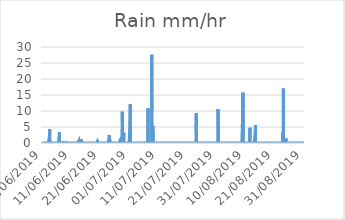
| Category | Rain |
|---|---|
| 01/06/2019 | 0 |
| 01/06/2019 | 0 |
| 01/06/2019 | 0 |
| 01/06/2019 | 0 |
| 01/06/2019 | 0 |
| 01/06/2019 | 0 |
| 01/06/2019 | 0 |
| 01/06/2019 | 0 |
| 01/06/2019 | 0 |
| 01/06/2019 | 0 |
| 01/06/2019 | 0 |
| 01/06/2019 | 0 |
| 01/06/2019 | 0 |
| 01/06/2019 | 0 |
| 01/06/2019 | 0 |
| 01/06/2019 | 0 |
| 01/06/2019 | 0 |
| 01/06/2019 | 0 |
| 01/06/2019 | 0 |
| 01/06/2019 | 0 |
| 01/06/2019 | 0 |
| 01/06/2019 | 0 |
| 01/06/2019 | 0 |
| 01/06/2019 | 0 |
| 02/06/2019 | 0 |
| 02/06/2019 | 0 |
| 02/06/2019 | 0 |
| 02/06/2019 | 0 |
| 02/06/2019 | 0 |
| 02/06/2019 | 0 |
| 02/06/2019 | 0 |
| 02/06/2019 | 0 |
| 02/06/2019 | 0 |
| 02/06/2019 | 0 |
| 02/06/2019 | 0 |
| 02/06/2019 | 0 |
| 02/06/2019 | 0 |
| 02/06/2019 | 0 |
| 02/06/2019 | 0 |
| 02/06/2019 | 0 |
| 02/06/2019 | 0 |
| 02/06/2019 | 0 |
| 02/06/2019 | 0 |
| 02/06/2019 | 0 |
| 02/06/2019 | 0 |
| 02/06/2019 | 0 |
| 02/06/2019 | 0 |
| 02/06/2019 | 0 |
| 03/06/2019 | 0 |
| 03/06/2019 | 0 |
| 03/06/2019 | 0 |
| 03/06/2019 | 0 |
| 03/06/2019 | 0 |
| 03/06/2019 | 0 |
| 03/06/2019 | 0 |
| 03/06/2019 | 0 |
| 03/06/2019 | 0 |
| 03/06/2019 | 0 |
| 03/06/2019 | 0 |
| 03/06/2019 | 0 |
| 03/06/2019 | 0 |
| 03/06/2019 | 0 |
| 03/06/2019 | 0 |
| 03/06/2019 | 2.6 |
| 03/06/2019 | 4.3 |
| 03/06/2019 | 0.2 |
| 03/06/2019 | 0 |
| 03/06/2019 | 0 |
| 03/06/2019 | 0 |
| 03/06/2019 | 0 |
| 03/06/2019 | 0 |
| 03/06/2019 | 0 |
| 04/06/2019 | 0 |
| 04/06/2019 | 0 |
| 04/06/2019 | 0 |
| 04/06/2019 | 0 |
| 04/06/2019 | 0 |
| 04/06/2019 | 0 |
| 04/06/2019 | 0 |
| 04/06/2019 | 0 |
| 04/06/2019 | 0 |
| 04/06/2019 | 0 |
| 04/06/2019 | 0 |
| 04/06/2019 | 0 |
| 04/06/2019 | 0 |
| 04/06/2019 | 0 |
| 04/06/2019 | 0 |
| 04/06/2019 | 0 |
| 04/06/2019 | 0 |
| 04/06/2019 | 0 |
| 04/06/2019 | 0 |
| 04/06/2019 | 0 |
| 04/06/2019 | 0 |
| 04/06/2019 | 0 |
| 04/06/2019 | 0 |
| 04/06/2019 | 0 |
| 05/06/2019 | 0 |
| 05/06/2019 | 0 |
| 05/06/2019 | 0 |
| 05/06/2019 | 0 |
| 05/06/2019 | 0 |
| 05/06/2019 | 0 |
| 05/06/2019 | 0 |
| 05/06/2019 | 0 |
| 05/06/2019 | 0 |
| 05/06/2019 | 0 |
| 05/06/2019 | 0 |
| 05/06/2019 | 0 |
| 05/06/2019 | 0 |
| 05/06/2019 | 0 |
| 05/06/2019 | 0 |
| 05/06/2019 | 0 |
| 05/06/2019 | 0 |
| 05/06/2019 | 0 |
| 05/06/2019 | 0 |
| 05/06/2019 | 0 |
| 05/06/2019 | 0 |
| 05/06/2019 | 0 |
| 05/06/2019 | 0 |
| 05/06/2019 | 0 |
| 06/06/2019 | 0 |
| 06/06/2019 | 0 |
| 06/06/2019 | 0 |
| 06/06/2019 | 0 |
| 06/06/2019 | 0 |
| 06/06/2019 | 0 |
| 06/06/2019 | 0 |
| 06/06/2019 | 0 |
| 06/06/2019 | 0 |
| 06/06/2019 | 0 |
| 06/06/2019 | 0 |
| 06/06/2019 | 0 |
| 06/06/2019 | 0 |
| 06/06/2019 | 0 |
| 06/06/2019 | 0 |
| 06/06/2019 | 0 |
| 06/06/2019 | 0 |
| 06/06/2019 | 0 |
| 06/06/2019 | 0 |
| 06/06/2019 | 0 |
| 06/06/2019 | 0 |
| 06/06/2019 | 0 |
| 06/06/2019 | 0 |
| 06/06/2019 | 0 |
| 07/06/2019 | 0 |
| 07/06/2019 | 0 |
| 07/06/2019 | 3.4 |
| 07/06/2019 | 0 |
| 07/06/2019 | 0 |
| 07/06/2019 | 0 |
| 07/06/2019 | 0 |
| 07/06/2019 | 0 |
| 07/06/2019 | 0 |
| 07/06/2019 | 0 |
| 07/06/2019 | 0 |
| 07/06/2019 | 0 |
| 07/06/2019 | 0 |
| 07/06/2019 | 0 |
| 07/06/2019 | 0 |
| 07/06/2019 | 0 |
| 07/06/2019 | 0 |
| 07/06/2019 | 0 |
| 07/06/2019 | 0 |
| 07/06/2019 | 0 |
| 07/06/2019 | 0 |
| 07/06/2019 | 0 |
| 07/06/2019 | 0 |
| 07/06/2019 | 0 |
| 08/06/2019 | 0 |
| 08/06/2019 | 0 |
| 08/06/2019 | 0 |
| 08/06/2019 | 0 |
| 08/06/2019 | 0.2 |
| 08/06/2019 | 0.1 |
| 08/06/2019 | 0.2 |
| 08/06/2019 | 0 |
| 08/06/2019 | 0.2 |
| 08/06/2019 | 0 |
| 08/06/2019 | 0 |
| 08/06/2019 | 0 |
| 08/06/2019 | 0 |
| 08/06/2019 | 0 |
| 08/06/2019 | 0 |
| 08/06/2019 | 0 |
| 08/06/2019 | 0 |
| 08/06/2019 | 0 |
| 08/06/2019 | 0 |
| 08/06/2019 | 0 |
| 08/06/2019 | 0 |
| 08/06/2019 | 0 |
| 08/06/2019 | 0 |
| 08/06/2019 | 0 |
| 09/06/2019 | 0 |
| 09/06/2019 | 0 |
| 09/06/2019 | 0 |
| 09/06/2019 | 0 |
| 09/06/2019 | 0 |
| 09/06/2019 | 0 |
| 09/06/2019 | 0 |
| 09/06/2019 | 0 |
| 09/06/2019 | 0 |
| 09/06/2019 | 0.2 |
| 09/06/2019 | 0 |
| 09/06/2019 | 0 |
| 09/06/2019 | 0 |
| 09/06/2019 | 0 |
| 09/06/2019 | 0 |
| 09/06/2019 | 0 |
| 09/06/2019 | 0 |
| 09/06/2019 | 0 |
| 09/06/2019 | 0 |
| 09/06/2019 | 0 |
| 09/06/2019 | 0 |
| 09/06/2019 | 0 |
| 09/06/2019 | 0 |
| 09/06/2019 | 0 |
| 10/06/2019 | 0 |
| 10/06/2019 | 0 |
| 10/06/2019 | 0 |
| 10/06/2019 | 0 |
| 10/06/2019 | 0 |
| 10/06/2019 | 0 |
| 10/06/2019 | 0 |
| 10/06/2019 | 0 |
| 10/06/2019 | 0 |
| 10/06/2019 | 0 |
| 10/06/2019 | 0 |
| 10/06/2019 | 0 |
| 10/06/2019 | 0 |
| 10/06/2019 | 0 |
| 10/06/2019 | 0 |
| 10/06/2019 | 0 |
| 10/06/2019 | 0 |
| 10/06/2019 | 0 |
| 10/06/2019 | 0 |
| 10/06/2019 | 0 |
| 10/06/2019 | 0 |
| 10/06/2019 | 0 |
| 10/06/2019 | 0 |
| 10/06/2019 | 0 |
| 11/06/2019 | 0 |
| 11/06/2019 | 0 |
| 11/06/2019 | 0 |
| 11/06/2019 | 0 |
| 11/06/2019 | 0 |
| 11/06/2019 | 0 |
| 11/06/2019 | 0 |
| 11/06/2019 | 0 |
| 11/06/2019 | 0 |
| 11/06/2019 | 0 |
| 11/06/2019 | 0 |
| 11/06/2019 | 0 |
| 11/06/2019 | 0 |
| 11/06/2019 | 0 |
| 11/06/2019 | 0 |
| 11/06/2019 | 0 |
| 11/06/2019 | 0.1 |
| 11/06/2019 | 0 |
| 11/06/2019 | 0 |
| 11/06/2019 | 0 |
| 11/06/2019 | 0 |
| 11/06/2019 | 0 |
| 11/06/2019 | 0 |
| 11/06/2019 | 0 |
| 12/06/2019 | 0 |
| 12/06/2019 | 0 |
| 12/06/2019 | 0 |
| 12/06/2019 | 0 |
| 12/06/2019 | 0 |
| 12/06/2019 | 0 |
| 12/06/2019 | 0 |
| 12/06/2019 | 0 |
| 12/06/2019 | 0 |
| 12/06/2019 | 0 |
| 12/06/2019 | 0 |
| 12/06/2019 | 0 |
| 12/06/2019 | 0 |
| 12/06/2019 | 0 |
| 12/06/2019 | 0 |
| 12/06/2019 | 0 |
| 12/06/2019 | 0 |
| 12/06/2019 | 0 |
| 12/06/2019 | 0 |
| 12/06/2019 | 0 |
| 12/06/2019 | 0 |
| 12/06/2019 | 0 |
| 12/06/2019 | 0 |
| 12/06/2019 | 0 |
| 13/06/2019 | 0 |
| 13/06/2019 | 0 |
| 13/06/2019 | 0.3 |
| 13/06/2019 | 0.1 |
| 13/06/2019 | 0 |
| 13/06/2019 | 0 |
| 13/06/2019 | 0 |
| 13/06/2019 | 0 |
| 13/06/2019 | 0 |
| 13/06/2019 | 0 |
| 13/06/2019 | 0 |
| 13/06/2019 | 0 |
| 13/06/2019 | 0 |
| 13/06/2019 | 0 |
| 13/06/2019 | 0 |
| 13/06/2019 | 0 |
| 13/06/2019 | 0 |
| 13/06/2019 | 0 |
| 13/06/2019 | 0 |
| 13/06/2019 | 0.1 |
| 13/06/2019 | 0.6 |
| 13/06/2019 | 0.1 |
| 13/06/2019 | 0 |
| 13/06/2019 | 0 |
| 14/06/2019 | 0 |
| 14/06/2019 | 0 |
| 14/06/2019 | 0 |
| 14/06/2019 | 0 |
| 14/06/2019 | 0 |
| 14/06/2019 | 0 |
| 14/06/2019 | 0 |
| 14/06/2019 | 0 |
| 14/06/2019 | 0 |
| 14/06/2019 | 0 |
| 14/06/2019 | 0 |
| 14/06/2019 | 0 |
| 14/06/2019 | 0 |
| 14/06/2019 | 0 |
| 14/06/2019 | 0 |
| 14/06/2019 | 0 |
| 14/06/2019 | 0 |
| 14/06/2019 | 1.2 |
| 14/06/2019 | 0 |
| 14/06/2019 | 0 |
| 14/06/2019 | 0 |
| 14/06/2019 | 0 |
| 14/06/2019 | 0 |
| 14/06/2019 | 0 |
| 15/06/2019 | 0 |
| 15/06/2019 | 0 |
| 15/06/2019 | 0 |
| 15/06/2019 | 0 |
| 15/06/2019 | 0 |
| 15/06/2019 | 0 |
| 15/06/2019 | 0 |
| 15/06/2019 | 0 |
| 15/06/2019 | 0 |
| 15/06/2019 | 0 |
| 15/06/2019 | 0 |
| 15/06/2019 | 0 |
| 15/06/2019 | 0 |
| 15/06/2019 | 0 |
| 15/06/2019 | 0 |
| 15/06/2019 | 0 |
| 15/06/2019 | 0 |
| 15/06/2019 | 0 |
| 15/06/2019 | 0 |
| 15/06/2019 | 0 |
| 15/06/2019 | 0 |
| 15/06/2019 | 0 |
| 15/06/2019 | 0 |
| 15/06/2019 | 0 |
| 16/06/2019 | 0 |
| 16/06/2019 | 0 |
| 16/06/2019 | 0 |
| 16/06/2019 | 0 |
| 16/06/2019 | 0 |
| 16/06/2019 | 0 |
| 16/06/2019 | 0 |
| 16/06/2019 | 0 |
| 16/06/2019 | 0 |
| 16/06/2019 | 0 |
| 16/06/2019 | 0 |
| 16/06/2019 | 0 |
| 16/06/2019 | 0 |
| 16/06/2019 | 0 |
| 16/06/2019 | 0 |
| 16/06/2019 | 0 |
| 16/06/2019 | 0 |
| 16/06/2019 | 0 |
| 16/06/2019 | 0 |
| 16/06/2019 | 0 |
| 16/06/2019 | 0 |
| 16/06/2019 | 0 |
| 16/06/2019 | 0 |
| 16/06/2019 | 0 |
| 17/06/2019 | 0 |
| 17/06/2019 | 0 |
| 17/06/2019 | 0 |
| 17/06/2019 | 0 |
| 17/06/2019 | 0 |
| 17/06/2019 | 0 |
| 17/06/2019 | 0 |
| 17/06/2019 | 0 |
| 17/06/2019 | 0 |
| 17/06/2019 | 0 |
| 17/06/2019 | 0 |
| 17/06/2019 | 0 |
| 17/06/2019 | 0 |
| 17/06/2019 | 0 |
| 17/06/2019 | 0 |
| 17/06/2019 | 0 |
| 17/06/2019 | 0 |
| 17/06/2019 | 0 |
| 17/06/2019 | 0 |
| 17/06/2019 | 0 |
| 17/06/2019 | 0 |
| 17/06/2019 | 0 |
| 17/06/2019 | 0 |
| 17/06/2019 | 0 |
| 18/06/2019 | 0 |
| 18/06/2019 | 0 |
| 18/06/2019 | 0 |
| 18/06/2019 | 0 |
| 18/06/2019 | 0 |
| 18/06/2019 | 0 |
| 18/06/2019 | 0 |
| 18/06/2019 | 0 |
| 18/06/2019 | 0 |
| 18/06/2019 | 0 |
| 18/06/2019 | 0 |
| 18/06/2019 | 0 |
| 18/06/2019 | 0 |
| 18/06/2019 | 0 |
| 18/06/2019 | 0 |
| 18/06/2019 | 0 |
| 18/06/2019 | 0 |
| 18/06/2019 | 0 |
| 18/06/2019 | 0 |
| 18/06/2019 | 0 |
| 18/06/2019 | 0 |
| 18/06/2019 | 0 |
| 18/06/2019 | 0 |
| 18/06/2019 | 0 |
| 19/06/2019 | 0 |
| 19/06/2019 | 0 |
| 19/06/2019 | 0 |
| 19/06/2019 | 0 |
| 19/06/2019 | 0 |
| 19/06/2019 | 0 |
| 19/06/2019 | 0 |
| 19/06/2019 | 0 |
| 19/06/2019 | 0 |
| 19/06/2019 | 0 |
| 19/06/2019 | 0 |
| 19/06/2019 | 0.1 |
| 19/06/2019 | 0 |
| 19/06/2019 | 0 |
| 19/06/2019 | 0 |
| 19/06/2019 | 0 |
| 19/06/2019 | 0 |
| 19/06/2019 | 0 |
| 19/06/2019 | 0 |
| 19/06/2019 | 0 |
| 19/06/2019 | 0 |
| 19/06/2019 | 0 |
| 19/06/2019 | 0 |
| 19/06/2019 | 0 |
| 20/06/2019 | 0 |
| 20/06/2019 | 0 |
| 20/06/2019 | 0 |
| 20/06/2019 | 0 |
| 20/06/2019 | 0 |
| 20/06/2019 | 0 |
| 20/06/2019 | 0.4 |
| 20/06/2019 | 0.7 |
| 20/06/2019 | 0 |
| 20/06/2019 | 0.8 |
| 20/06/2019 | 0.1 |
| 20/06/2019 | 0 |
| 20/06/2019 | 0 |
| 20/06/2019 | 0 |
| 20/06/2019 | 0 |
| 20/06/2019 | 0 |
| 20/06/2019 | 0 |
| 20/06/2019 | 0 |
| 20/06/2019 | 0 |
| 20/06/2019 | 0 |
| 20/06/2019 | 0 |
| 20/06/2019 | 0 |
| 20/06/2019 | 0 |
| 20/06/2019 | 0 |
| 21/06/2019 | 0 |
| 21/06/2019 | 0 |
| 21/06/2019 | 0 |
| 21/06/2019 | 0 |
| 21/06/2019 | 0 |
| 21/06/2019 | 0 |
| 21/06/2019 | 0 |
| 21/06/2019 | 0 |
| 21/06/2019 | 0.1 |
| 21/06/2019 | 0 |
| 21/06/2019 | 0 |
| 21/06/2019 | 0 |
| 21/06/2019 | 0 |
| 21/06/2019 | 0 |
| 21/06/2019 | 0 |
| 21/06/2019 | 0.1 |
| 21/06/2019 | 0 |
| 21/06/2019 | 0 |
| 21/06/2019 | 0 |
| 21/06/2019 | 0 |
| 21/06/2019 | 0 |
| 21/06/2019 | 0 |
| 21/06/2019 | 0 |
| 21/06/2019 | 0 |
| 22/06/2019 | 0 |
| 22/06/2019 | 0 |
| 22/06/2019 | 0 |
| 22/06/2019 | 0 |
| 22/06/2019 | 0 |
| 22/06/2019 | 0 |
| 22/06/2019 | 0 |
| 22/06/2019 | 0 |
| 22/06/2019 | 0 |
| 22/06/2019 | 0 |
| 22/06/2019 | 0 |
| 22/06/2019 | 0 |
| 22/06/2019 | 0.2 |
| 22/06/2019 | 0.1 |
| 22/06/2019 | 0 |
| 22/06/2019 | 0 |
| 22/06/2019 | 0 |
| 22/06/2019 | 0 |
| 22/06/2019 | 0 |
| 22/06/2019 | 0 |
| 22/06/2019 | 0 |
| 22/06/2019 | 0 |
| 22/06/2019 | 0 |
| 22/06/2019 | 0 |
| 23/06/2019 | 0 |
| 23/06/2019 | 0 |
| 23/06/2019 | 0 |
| 23/06/2019 | 0 |
| 23/06/2019 | 0 |
| 23/06/2019 | 0 |
| 23/06/2019 | 0 |
| 23/06/2019 | 0 |
| 23/06/2019 | 0 |
| 23/06/2019 | 0 |
| 23/06/2019 | 0 |
| 23/06/2019 | 0 |
| 23/06/2019 | 0 |
| 23/06/2019 | 0 |
| 23/06/2019 | 0 |
| 23/06/2019 | 0 |
| 23/06/2019 | 0 |
| 23/06/2019 | 0 |
| 23/06/2019 | 0 |
| 23/06/2019 | 0 |
| 23/06/2019 | 0 |
| 23/06/2019 | 0 |
| 23/06/2019 | 0 |
| 23/06/2019 | 0 |
| 24/06/2019 | 0 |
| 24/06/2019 | 0 |
| 24/06/2019 | 0 |
| 24/06/2019 | 0 |
| 24/06/2019 | 0 |
| 24/06/2019 | 0 |
| 24/06/2019 | 0 |
| 24/06/2019 | 0 |
| 24/06/2019 | 0 |
| 24/06/2019 | 0 |
| 24/06/2019 | 0 |
| 24/06/2019 | 0 |
| 24/06/2019 | 0 |
| 24/06/2019 | 2.5 |
| 24/06/2019 | 0.1 |
| 24/06/2019 | 0 |
| 24/06/2019 | 0 |
| 24/06/2019 | 0.3 |
| 24/06/2019 | 0.1 |
| 24/06/2019 | 0.5 |
| 24/06/2019 | 0.4 |
| 24/06/2019 | 0 |
| 24/06/2019 | 0 |
| 24/06/2019 | 0 |
| 25/06/2019 | 0 |
| 25/06/2019 | 0 |
| 25/06/2019 | 0 |
| 25/06/2019 | 0 |
| 25/06/2019 | 0 |
| 25/06/2019 | 0 |
| 25/06/2019 | 0 |
| 25/06/2019 | 0 |
| 25/06/2019 | 0 |
| 25/06/2019 | 0 |
| 25/06/2019 | 0 |
| 25/06/2019 | 0 |
| 25/06/2019 | 0 |
| 25/06/2019 | 0 |
| 25/06/2019 | 0 |
| 25/06/2019 | 0 |
| 25/06/2019 | 0 |
| 25/06/2019 | 0 |
| 25/06/2019 | 0 |
| 25/06/2019 | 0 |
| 25/06/2019 | 0 |
| 25/06/2019 | 0 |
| 25/06/2019 | 0 |
| 25/06/2019 | 0 |
| 26/06/2019 | 0 |
| 26/06/2019 | 0 |
| 26/06/2019 | 0 |
| 26/06/2019 | 0 |
| 26/06/2019 | 0 |
| 26/06/2019 | 0 |
| 26/06/2019 | 0 |
| 26/06/2019 | 0 |
| 26/06/2019 | 0 |
| 26/06/2019 | 0 |
| 26/06/2019 | 0 |
| 26/06/2019 | 0 |
| 26/06/2019 | 0 |
| 26/06/2019 | 0 |
| 26/06/2019 | 0 |
| 26/06/2019 | 0 |
| 26/06/2019 | 0 |
| 26/06/2019 | 0 |
| 26/06/2019 | 0 |
| 26/06/2019 | 0 |
| 26/06/2019 | 0 |
| 26/06/2019 | 0 |
| 26/06/2019 | 0 |
| 26/06/2019 | 0 |
| 27/06/2019 | 0 |
| 27/06/2019 | 0 |
| 27/06/2019 | 0 |
| 27/06/2019 | 0 |
| 27/06/2019 | 0 |
| 27/06/2019 | 0 |
| 27/06/2019 | 0 |
| 27/06/2019 | 0 |
| 27/06/2019 | 0 |
| 27/06/2019 | 0 |
| 27/06/2019 | 0 |
| 27/06/2019 | 0 |
| 27/06/2019 | 0 |
| 27/06/2019 | 0 |
| 27/06/2019 | 0 |
| 27/06/2019 | 0 |
| 27/06/2019 | 0 |
| 27/06/2019 | 0 |
| 27/06/2019 | 0 |
| 27/06/2019 | 0 |
| 27/06/2019 | 0 |
| 27/06/2019 | 0 |
| 27/06/2019 | 0 |
| 27/06/2019 | 0 |
| 28/06/2019 | 0 |
| 28/06/2019 | 0 |
| 28/06/2019 | 0.1 |
| 28/06/2019 | 0.5 |
| 28/06/2019 | 0.5 |
| 28/06/2019 | 0 |
| 28/06/2019 | 0 |
| 28/06/2019 | 0 |
| 28/06/2019 | 0 |
| 28/06/2019 | 0 |
| 28/06/2019 | 0 |
| 28/06/2019 | 0 |
| 28/06/2019 | 0 |
| 28/06/2019 | 0 |
| 28/06/2019 | 0 |
| 28/06/2019 | 0 |
| 28/06/2019 | 0 |
| 28/06/2019 | 0 |
| 28/06/2019 | 0 |
| 28/06/2019 | 0 |
| 28/06/2019 | 0 |
| 28/06/2019 | 0 |
| 28/06/2019 | 0 |
| 28/06/2019 | 0 |
| 29/06/2019 | 0 |
| 29/06/2019 | 0 |
| 29/06/2019 | 9.8 |
| 29/06/2019 | 0 |
| 29/06/2019 | 0 |
| 29/06/2019 | 0 |
| 29/06/2019 | 0 |
| 29/06/2019 | 0 |
| 29/06/2019 | 0 |
| 29/06/2019 | 0 |
| 29/06/2019 | 0 |
| 29/06/2019 | 0 |
| 29/06/2019 | 0 |
| 29/06/2019 | 0 |
| 29/06/2019 | 3.2 |
| 29/06/2019 | 0 |
| 29/06/2019 | 0 |
| 29/06/2019 | 0 |
| 29/06/2019 | 0 |
| 29/06/2019 | 0 |
| 29/06/2019 | 0 |
| 29/06/2019 | 0 |
| 29/06/2019 | 0 |
| 29/06/2019 | 0 |
| 30/06/2019 | 0 |
| 30/06/2019 | 0 |
| 30/06/2019 | 0 |
| 30/06/2019 | 0 |
| 30/06/2019 | 0 |
| 30/06/2019 | 0 |
| 30/06/2019 | 0 |
| 30/06/2019 | 0 |
| 30/06/2019 | 0 |
| 30/06/2019 | 0 |
| 30/06/2019 | 0 |
| 30/06/2019 | 0 |
| 30/06/2019 | 0 |
| 30/06/2019 | 0 |
| 30/06/2019 | 0 |
| 30/06/2019 | 0 |
| 30/06/2019 | 0 |
| 30/06/2019 | 0 |
| 30/06/2019 | 0 |
| 30/06/2019 | 0 |
| 30/06/2019 | 0 |
| 30/06/2019 | 0 |
| 30/06/2019 | 0 |
| 30/06/2019 | 0 |
| 01/07/2019 | 0 |
| 01/07/2019 | 0 |
| 01/07/2019 | 0 |
| 01/07/2019 | 0 |
| 01/07/2019 | 0 |
| 01/07/2019 | 0 |
| 01/07/2019 | 0 |
| 01/07/2019 | 0 |
| 01/07/2019 | 0 |
| 01/07/2019 | 0 |
| 01/07/2019 | 0 |
| 01/07/2019 | 0 |
| 01/07/2019 | 0 |
| 01/07/2019 | 0 |
| 01/07/2019 | 0 |
| 01/07/2019 | 0 |
| 01/07/2019 | 0 |
| 01/07/2019 | 0 |
| 01/07/2019 | 0 |
| 01/07/2019 | 0 |
| 01/07/2019 | 0 |
| 01/07/2019 | 12.1 |
| 01/07/2019 | 0.2 |
| 01/07/2019 | 0 |
| 02/07/2019 | 0 |
| 02/07/2019 | 0 |
| 02/07/2019 | 0 |
| 02/07/2019 | 0 |
| 02/07/2019 | 0 |
| 02/07/2019 | 0 |
| 02/07/2019 | 0 |
| 02/07/2019 | 0 |
| 02/07/2019 | 0 |
| 02/07/2019 | 0 |
| 02/07/2019 | 0 |
| 02/07/2019 | 0 |
| 02/07/2019 | 0 |
| 02/07/2019 | 0 |
| 02/07/2019 | 0 |
| 02/07/2019 | 0 |
| 02/07/2019 | 0 |
| 02/07/2019 | 0 |
| 02/07/2019 | 0 |
| 02/07/2019 | 0 |
| 02/07/2019 | 0 |
| 02/07/2019 | 0 |
| 02/07/2019 | 0 |
| 02/07/2019 | 0 |
| 03/07/2019 | 0 |
| 03/07/2019 | 0 |
| 03/07/2019 | 0 |
| 03/07/2019 | 0 |
| 03/07/2019 | 0 |
| 03/07/2019 | 0 |
| 03/07/2019 | 0 |
| 03/07/2019 | 0 |
| 03/07/2019 | 0 |
| 03/07/2019 | 0 |
| 03/07/2019 | 0 |
| 03/07/2019 | 0 |
| 03/07/2019 | 0 |
| 03/07/2019 | 0 |
| 03/07/2019 | 0 |
| 03/07/2019 | 0 |
| 03/07/2019 | 0 |
| 03/07/2019 | 0 |
| 03/07/2019 | 0 |
| 03/07/2019 | 0 |
| 03/07/2019 | 0 |
| 03/07/2019 | 0 |
| 03/07/2019 | 0 |
| 03/07/2019 | 0 |
| 04/07/2019 | 0 |
| 04/07/2019 | 0 |
| 04/07/2019 | 0 |
| 04/07/2019 | 0 |
| 04/07/2019 | 0 |
| 04/07/2019 | 0 |
| 04/07/2019 | 0 |
| 04/07/2019 | 0 |
| 04/07/2019 | 0 |
| 04/07/2019 | 0 |
| 04/07/2019 | 0 |
| 04/07/2019 | 0 |
| 04/07/2019 | 0 |
| 04/07/2019 | 0 |
| 04/07/2019 | 0 |
| 04/07/2019 | 0 |
| 04/07/2019 | 0 |
| 04/07/2019 | 0 |
| 04/07/2019 | 0 |
| 04/07/2019 | 0 |
| 04/07/2019 | 0 |
| 04/07/2019 | 0 |
| 04/07/2019 | 0 |
| 04/07/2019 | 0 |
| 05/07/2019 | 0 |
| 05/07/2019 | 0 |
| 05/07/2019 | 0 |
| 05/07/2019 | 0 |
| 05/07/2019 | 0 |
| 05/07/2019 | 0 |
| 05/07/2019 | 0 |
| 05/07/2019 | 0 |
| 05/07/2019 | 0 |
| 05/07/2019 | 0 |
| 05/07/2019 | 0 |
| 05/07/2019 | 0 |
| 05/07/2019 | 0 |
| 05/07/2019 | 0 |
| 05/07/2019 | 0 |
| 05/07/2019 | 0 |
| 05/07/2019 | 0 |
| 05/07/2019 | 0 |
| 05/07/2019 | 0 |
| 05/07/2019 | 0 |
| 05/07/2019 | 0 |
| 05/07/2019 | 0 |
| 05/07/2019 | 0 |
| 05/07/2019 | 0 |
| 06/07/2019 | 0 |
| 06/07/2019 | 0 |
| 06/07/2019 | 0 |
| 06/07/2019 | 0 |
| 06/07/2019 | 0 |
| 06/07/2019 | 0 |
| 06/07/2019 | 0 |
| 06/07/2019 | 0 |
| 06/07/2019 | 0 |
| 06/07/2019 | 0 |
| 06/07/2019 | 0 |
| 06/07/2019 | 0 |
| 06/07/2019 | 0 |
| 06/07/2019 | 0 |
| 06/07/2019 | 0 |
| 06/07/2019 | 0 |
| 06/07/2019 | 0 |
| 06/07/2019 | 0 |
| 06/07/2019 | 0 |
| 06/07/2019 | 0 |
| 06/07/2019 | 0 |
| 06/07/2019 | 0 |
| 06/07/2019 | 0 |
| 06/07/2019 | 0 |
| 07/07/2019 | 0 |
| 07/07/2019 | 0 |
| 07/07/2019 | 0 |
| 07/07/2019 | 0 |
| 07/07/2019 | 0 |
| 07/07/2019 | 0 |
| 07/07/2019 | 0 |
| 07/07/2019 | 0 |
| 07/07/2019 | 0 |
| 07/07/2019 | 0 |
| 07/07/2019 | 0 |
| 07/07/2019 | 0 |
| 07/07/2019 | 0 |
| 07/07/2019 | 0 |
| 07/07/2019 | 0 |
| 07/07/2019 | 0 |
| 07/07/2019 | 0 |
| 07/07/2019 | 0 |
| 07/07/2019 | 0 |
| 07/07/2019 | 0 |
| 07/07/2019 | 0 |
| 07/07/2019 | 0 |
| 07/07/2019 | 0 |
| 07/07/2019 | 0 |
| 08/07/2019 | 0 |
| 08/07/2019 | 7.1 |
| 08/07/2019 | 10.8 |
| 08/07/2019 | 0 |
| 08/07/2019 | 0 |
| 08/07/2019 | 0 |
| 08/07/2019 | 0 |
| 08/07/2019 | 0 |
| 08/07/2019 | 0 |
| 08/07/2019 | 0 |
| 08/07/2019 | 0 |
| 08/07/2019 | 0 |
| 08/07/2019 | 0 |
| 08/07/2019 | 0 |
| 08/07/2019 | 0 |
| 08/07/2019 | 0 |
| 08/07/2019 | 0 |
| 08/07/2019 | 0.2 |
| 08/07/2019 | 0 |
| 08/07/2019 | 0 |
| 08/07/2019 | 0 |
| 08/07/2019 | 0 |
| 08/07/2019 | 0 |
| 08/07/2019 | 0 |
| 09/07/2019 | 0 |
| 09/07/2019 | 0 |
| 09/07/2019 | 0 |
| 09/07/2019 | 0 |
| 09/07/2019 | 0 |
| 09/07/2019 | 0 |
| 09/07/2019 | 0 |
| 09/07/2019 | 0.1 |
| 09/07/2019 | 1 |
| 09/07/2019 | 27.6 |
| 09/07/2019 | 9.6 |
| 09/07/2019 | 2.8 |
| 09/07/2019 | 5.6 |
| 09/07/2019 | 3.6 |
| 09/07/2019 | 1 |
| 09/07/2019 | 1.8 |
| 09/07/2019 | 0.7 |
| 09/07/2019 | 0.1 |
| 09/07/2019 | 5.3 |
| 09/07/2019 | 0 |
| 09/07/2019 | 0 |
| 09/07/2019 | 0 |
| 09/07/2019 | 0 |
| 09/07/2019 | 0.2 |
| 10/07/2019 | 0 |
| 10/07/2019 | 0 |
| 10/07/2019 | 0 |
| 10/07/2019 | 0 |
| 10/07/2019 | 0 |
| 10/07/2019 | 0 |
| 10/07/2019 | 0 |
| 10/07/2019 | 0 |
| 10/07/2019 | 0 |
| 10/07/2019 | 0 |
| 10/07/2019 | 0 |
| 10/07/2019 | 0 |
| 10/07/2019 | 0 |
| 10/07/2019 | 0 |
| 10/07/2019 | 0 |
| 10/07/2019 | 0 |
| 10/07/2019 | 0 |
| 10/07/2019 | 0 |
| 10/07/2019 | 0 |
| 10/07/2019 | 0 |
| 10/07/2019 | 0 |
| 10/07/2019 | 0 |
| 10/07/2019 | 0 |
| 10/07/2019 | 0 |
| 11/07/2019 | 0 |
| 11/07/2019 | 0 |
| 11/07/2019 | 0 |
| 11/07/2019 | 0 |
| 11/07/2019 | 0 |
| 11/07/2019 | 0 |
| 11/07/2019 | 0 |
| 11/07/2019 | 0 |
| 11/07/2019 | 0 |
| 11/07/2019 | 0 |
| 11/07/2019 | 0 |
| 11/07/2019 | 0 |
| 11/07/2019 | 0 |
| 11/07/2019 | 0 |
| 11/07/2019 | 0 |
| 11/07/2019 | 0 |
| 11/07/2019 | 0 |
| 11/07/2019 | 0 |
| 11/07/2019 | 0 |
| 11/07/2019 | 0 |
| 11/07/2019 | 0 |
| 11/07/2019 | 0 |
| 11/07/2019 | 0 |
| 11/07/2019 | 0 |
| 12/07/2019 | 0 |
| 12/07/2019 | 0 |
| 12/07/2019 | 0 |
| 12/07/2019 | 0 |
| 12/07/2019 | 0 |
| 12/07/2019 | 0 |
| 12/07/2019 | 0 |
| 12/07/2019 | 0 |
| 12/07/2019 | 0 |
| 12/07/2019 | 0 |
| 12/07/2019 | 0 |
| 12/07/2019 | 0 |
| 12/07/2019 | 0 |
| 12/07/2019 | 0 |
| 12/07/2019 | 0 |
| 12/07/2019 | 0 |
| 12/07/2019 | 0 |
| 12/07/2019 | 0 |
| 12/07/2019 | 0 |
| 12/07/2019 | 0 |
| 12/07/2019 | 0 |
| 12/07/2019 | 0 |
| 12/07/2019 | 0 |
| 12/07/2019 | 0 |
| 13/07/2019 | 0 |
| 13/07/2019 | 0 |
| 13/07/2019 | 0 |
| 13/07/2019 | 0 |
| 13/07/2019 | 0 |
| 13/07/2019 | 0 |
| 13/07/2019 | 0 |
| 13/07/2019 | 0 |
| 13/07/2019 | 0 |
| 13/07/2019 | 0 |
| 13/07/2019 | 0 |
| 13/07/2019 | 0 |
| 13/07/2019 | 0 |
| 13/07/2019 | 0 |
| 13/07/2019 | 0 |
| 13/07/2019 | 0 |
| 13/07/2019 | 0 |
| 13/07/2019 | 0 |
| 13/07/2019 | 0 |
| 13/07/2019 | 0 |
| 13/07/2019 | 0 |
| 13/07/2019 | 0 |
| 13/07/2019 | 0 |
| 13/07/2019 | 0 |
| 14/07/2019 | 0 |
| 14/07/2019 | 0 |
| 14/07/2019 | 0 |
| 14/07/2019 | 0 |
| 14/07/2019 | 0 |
| 14/07/2019 | 0 |
| 14/07/2019 | 0 |
| 14/07/2019 | 0 |
| 14/07/2019 | 0 |
| 14/07/2019 | 0 |
| 14/07/2019 | 0 |
| 14/07/2019 | 0 |
| 14/07/2019 | 0 |
| 14/07/2019 | 0 |
| 14/07/2019 | 0 |
| 14/07/2019 | 0 |
| 14/07/2019 | 0 |
| 14/07/2019 | 0 |
| 14/07/2019 | 0 |
| 14/07/2019 | 0 |
| 14/07/2019 | 0 |
| 14/07/2019 | 0 |
| 14/07/2019 | 0 |
| 14/07/2019 | 0 |
| 15/07/2019 | 0 |
| 15/07/2019 | 0 |
| 15/07/2019 | 0 |
| 15/07/2019 | 0 |
| 15/07/2019 | 0 |
| 15/07/2019 | 0 |
| 15/07/2019 | 0 |
| 15/07/2019 | 0 |
| 15/07/2019 | 0 |
| 15/07/2019 | 0 |
| 15/07/2019 | 0 |
| 15/07/2019 | 0 |
| 15/07/2019 | 0 |
| 15/07/2019 | 0 |
| 15/07/2019 | 0 |
| 15/07/2019 | 0 |
| 15/07/2019 | 0 |
| 15/07/2019 | 0 |
| 15/07/2019 | 0 |
| 15/07/2019 | 0 |
| 15/07/2019 | 0 |
| 15/07/2019 | 0 |
| 15/07/2019 | 0 |
| 15/07/2019 | 0 |
| 16/07/2019 | 0 |
| 16/07/2019 | 0 |
| 16/07/2019 | 0 |
| 16/07/2019 | 0 |
| 16/07/2019 | 0 |
| 16/07/2019 | 0 |
| 16/07/2019 | 0 |
| 16/07/2019 | 0 |
| 16/07/2019 | 0 |
| 16/07/2019 | 0 |
| 16/07/2019 | 0 |
| 16/07/2019 | 0 |
| 16/07/2019 | 0 |
| 16/07/2019 | 0 |
| 16/07/2019 | 0 |
| 16/07/2019 | 0 |
| 16/07/2019 | 0 |
| 16/07/2019 | 0 |
| 16/07/2019 | 0 |
| 16/07/2019 | 0 |
| 16/07/2019 | 0 |
| 16/07/2019 | 0 |
| 16/07/2019 | 0 |
| 16/07/2019 | 0 |
| 17/07/2019 | 0 |
| 17/07/2019 | 0 |
| 17/07/2019 | 0 |
| 17/07/2019 | 0 |
| 17/07/2019 | 0 |
| 17/07/2019 | 0 |
| 17/07/2019 | 0 |
| 17/07/2019 | 0 |
| 17/07/2019 | 0 |
| 17/07/2019 | 0 |
| 17/07/2019 | 0 |
| 17/07/2019 | 0 |
| 17/07/2019 | 0 |
| 17/07/2019 | 0 |
| 17/07/2019 | 0 |
| 17/07/2019 | 0 |
| 17/07/2019 | 0 |
| 17/07/2019 | 0 |
| 17/07/2019 | 0 |
| 17/07/2019 | 0 |
| 17/07/2019 | 0 |
| 17/07/2019 | 0 |
| 17/07/2019 | 0 |
| 17/07/2019 | 0 |
| 18/07/2019 | 0 |
| 18/07/2019 | 0 |
| 18/07/2019 | 0 |
| 18/07/2019 | 0 |
| 18/07/2019 | 0 |
| 18/07/2019 | 0 |
| 18/07/2019 | 0 |
| 18/07/2019 | 0 |
| 18/07/2019 | 0 |
| 18/07/2019 | 0 |
| 18/07/2019 | 0 |
| 18/07/2019 | 0 |
| 18/07/2019 | 0 |
| 18/07/2019 | 0 |
| 18/07/2019 | 0 |
| 18/07/2019 | 0 |
| 18/07/2019 | 0 |
| 18/07/2019 | 0 |
| 18/07/2019 | 0 |
| 18/07/2019 | 0 |
| 18/07/2019 | 0 |
| 18/07/2019 | 0 |
| 18/07/2019 | 0 |
| 18/07/2019 | 0 |
| 19/07/2019 | 0 |
| 19/07/2019 | 0 |
| 19/07/2019 | 0 |
| 19/07/2019 | 0 |
| 19/07/2019 | 0 |
| 19/07/2019 | 0 |
| 19/07/2019 | 0 |
| 19/07/2019 | 0 |
| 19/07/2019 | 0 |
| 19/07/2019 | 0 |
| 19/07/2019 | 0 |
| 19/07/2019 | 0 |
| 19/07/2019 | 0 |
| 19/07/2019 | 0 |
| 19/07/2019 | 0 |
| 19/07/2019 | 0 |
| 19/07/2019 | 0 |
| 19/07/2019 | 0 |
| 19/07/2019 | 0 |
| 19/07/2019 | 0 |
| 19/07/2019 | 0 |
| 19/07/2019 | 0 |
| 19/07/2019 | 0 |
| 19/07/2019 | 0 |
| 20/07/2019 | 0 |
| 20/07/2019 | 0 |
| 20/07/2019 | 0 |
| 20/07/2019 | 0 |
| 20/07/2019 | 0 |
| 20/07/2019 | 0 |
| 20/07/2019 | 0 |
| 20/07/2019 | 0 |
| 20/07/2019 | 0 |
| 20/07/2019 | 0 |
| 20/07/2019 | 0 |
| 20/07/2019 | 0 |
| 20/07/2019 | 0 |
| 20/07/2019 | 0 |
| 20/07/2019 | 0 |
| 20/07/2019 | 0 |
| 20/07/2019 | 0 |
| 20/07/2019 | 0 |
| 20/07/2019 | 0 |
| 20/07/2019 | 0 |
| 20/07/2019 | 0 |
| 20/07/2019 | 0 |
| 20/07/2019 | 0 |
| 20/07/2019 | 0 |
| 21/07/2019 | 0 |
| 21/07/2019 | 0 |
| 21/07/2019 | 0 |
| 21/07/2019 | 0 |
| 21/07/2019 | 0 |
| 21/07/2019 | 0 |
| 21/07/2019 | 0 |
| 21/07/2019 | 0 |
| 21/07/2019 | 0 |
| 21/07/2019 | 0 |
| 21/07/2019 | 0 |
| 21/07/2019 | 0 |
| 21/07/2019 | 0 |
| 21/07/2019 | 0 |
| 21/07/2019 | 0 |
| 21/07/2019 | 0 |
| 21/07/2019 | 0 |
| 21/07/2019 | 0 |
| 21/07/2019 | 0 |
| 21/07/2019 | 0 |
| 21/07/2019 | 0 |
| 21/07/2019 | 0 |
| 21/07/2019 | 0 |
| 21/07/2019 | 0 |
| 22/07/2019 | 0 |
| 22/07/2019 | 0 |
| 22/07/2019 | 0 |
| 22/07/2019 | 0 |
| 22/07/2019 | 0 |
| 22/07/2019 | 0 |
| 22/07/2019 | 0 |
| 22/07/2019 | 0 |
| 22/07/2019 | 0 |
| 22/07/2019 | 0 |
| 22/07/2019 | 0 |
| 22/07/2019 | 0 |
| 22/07/2019 | 0 |
| 22/07/2019 | 0 |
| 22/07/2019 | 0 |
| 22/07/2019 | 0 |
| 22/07/2019 | 0 |
| 22/07/2019 | 0 |
| 22/07/2019 | 0 |
| 22/07/2019 | 0 |
| 22/07/2019 | 0 |
| 22/07/2019 | 0 |
| 22/07/2019 | 0 |
| 22/07/2019 | 0 |
| 23/07/2019 | 0 |
| 23/07/2019 | 0 |
| 23/07/2019 | 0 |
| 23/07/2019 | 0 |
| 23/07/2019 | 0 |
| 23/07/2019 | 0 |
| 23/07/2019 | 0 |
| 23/07/2019 | 0 |
| 23/07/2019 | 0 |
| 23/07/2019 | 0 |
| 23/07/2019 | 0 |
| 23/07/2019 | 0 |
| 23/07/2019 | 0 |
| 23/07/2019 | 0 |
| 23/07/2019 | 0 |
| 23/07/2019 | 0 |
| 23/07/2019 | 0 |
| 23/07/2019 | 0 |
| 23/07/2019 | 0 |
| 23/07/2019 | 0 |
| 23/07/2019 | 0 |
| 23/07/2019 | 0 |
| 23/07/2019 | 0 |
| 23/07/2019 | 0 |
| 24/07/2019 | 0 |
| 24/07/2019 | 0 |
| 24/07/2019 | 0 |
| 24/07/2019 | 0 |
| 24/07/2019 | 0 |
| 24/07/2019 | 0 |
| 24/07/2019 | 0 |
| 24/07/2019 | 0 |
| 24/07/2019 | 0 |
| 24/07/2019 | 0 |
| 24/07/2019 | 0 |
| 24/07/2019 | 0 |
| 24/07/2019 | 0 |
| 24/07/2019 | 0 |
| 24/07/2019 | 0 |
| 24/07/2019 | 0 |
| 24/07/2019 | 0 |
| 24/07/2019 | 0 |
| 24/07/2019 | 0 |
| 24/07/2019 | 0 |
| 24/07/2019 | 0 |
| 24/07/2019 | 0 |
| 24/07/2019 | 0 |
| 24/07/2019 | 9.3 |
| 25/07/2019 | 0 |
| 25/07/2019 | 0 |
| 25/07/2019 | 0 |
| 25/07/2019 | 0 |
| 25/07/2019 | 0 |
| 25/07/2019 | 0 |
| 25/07/2019 | 0 |
| 25/07/2019 | 0 |
| 25/07/2019 | 0 |
| 25/07/2019 | 0 |
| 25/07/2019 | 0 |
| 25/07/2019 | 0 |
| 25/07/2019 | 0 |
| 25/07/2019 | 0 |
| 25/07/2019 | 0 |
| 25/07/2019 | 0 |
| 25/07/2019 | 0 |
| 25/07/2019 | 0 |
| 25/07/2019 | 0 |
| 25/07/2019 | 0 |
| 25/07/2019 | 0 |
| 25/07/2019 | 0 |
| 25/07/2019 | 0 |
| 25/07/2019 | 0 |
| 26/07/2019 | 0 |
| 26/07/2019 | 0 |
| 26/07/2019 | 0 |
| 26/07/2019 | 0 |
| 26/07/2019 | 0 |
| 26/07/2019 | 0 |
| 26/07/2019 | 0 |
| 26/07/2019 | 0 |
| 26/07/2019 | 0 |
| 26/07/2019 | 0 |
| 26/07/2019 | 0 |
| 26/07/2019 | 0 |
| 26/07/2019 | 0 |
| 26/07/2019 | 0 |
| 26/07/2019 | 0 |
| 26/07/2019 | 0 |
| 26/07/2019 | 0 |
| 26/07/2019 | 0 |
| 26/07/2019 | 0 |
| 26/07/2019 | 0 |
| 26/07/2019 | 0 |
| 26/07/2019 | 0 |
| 26/07/2019 | 0 |
| 26/07/2019 | 0 |
| 27/07/2019 | 0 |
| 27/07/2019 | 0 |
| 27/07/2019 | 0 |
| 27/07/2019 | 0 |
| 27/07/2019 | 0 |
| 27/07/2019 | 0 |
| 27/07/2019 | 0 |
| 27/07/2019 | 0 |
| 27/07/2019 | 0 |
| 27/07/2019 | 0 |
| 27/07/2019 | 0 |
| 27/07/2019 | 0 |
| 27/07/2019 | 0 |
| 27/07/2019 | 0 |
| 27/07/2019 | 0 |
| 27/07/2019 | 0 |
| 27/07/2019 | 0 |
| 27/07/2019 | 0 |
| 27/07/2019 | 0 |
| 27/07/2019 | 0 |
| 27/07/2019 | 0 |
| 27/07/2019 | 0 |
| 27/07/2019 | 0 |
| 27/07/2019 | 0 |
| 28/07/2019 | 0 |
| 28/07/2019 | 0 |
| 28/07/2019 | 0 |
| 28/07/2019 | 0 |
| 28/07/2019 | 0 |
| 28/07/2019 | 0 |
| 28/07/2019 | 0 |
| 28/07/2019 | 0 |
| 28/07/2019 | 0 |
| 28/07/2019 | 0 |
| 28/07/2019 | 0 |
| 28/07/2019 | 0 |
| 28/07/2019 | 0 |
| 28/07/2019 | 0 |
| 28/07/2019 | 0 |
| 28/07/2019 | 0 |
| 28/07/2019 | 0 |
| 28/07/2019 | 0 |
| 28/07/2019 | 0 |
| 28/07/2019 | 0 |
| 28/07/2019 | 0 |
| 28/07/2019 | 0 |
| 28/07/2019 | 0 |
| 28/07/2019 | 0 |
| 29/07/2019 | 0 |
| 29/07/2019 | 0 |
| 29/07/2019 | 0 |
| 29/07/2019 | 0 |
| 29/07/2019 | 0 |
| 29/07/2019 | 0 |
| 29/07/2019 | 0 |
| 29/07/2019 | 0 |
| 29/07/2019 | 0 |
| 29/07/2019 | 0 |
| 29/07/2019 | 0 |
| 29/07/2019 | 0 |
| 29/07/2019 | 0 |
| 29/07/2019 | 0 |
| 29/07/2019 | 0 |
| 29/07/2019 | 0 |
| 29/07/2019 | 0 |
| 29/07/2019 | 0 |
| 29/07/2019 | 0 |
| 29/07/2019 | 0 |
| 29/07/2019 | 0 |
| 29/07/2019 | 0 |
| 29/07/2019 | 0 |
| 29/07/2019 | 0 |
| 30/07/2019 | 0 |
| 30/07/2019 | 0 |
| 30/07/2019 | 0 |
| 30/07/2019 | 0 |
| 30/07/2019 | 0 |
| 30/07/2019 | 0 |
| 30/07/2019 | 0 |
| 30/07/2019 | 0 |
| 30/07/2019 | 0 |
| 30/07/2019 | 0 |
| 30/07/2019 | 0 |
| 30/07/2019 | 0 |
| 30/07/2019 | 0 |
| 30/07/2019 | 0 |
| 30/07/2019 | 0 |
| 30/07/2019 | 0 |
| 30/07/2019 | 0 |
| 30/07/2019 | 0 |
| 30/07/2019 | 0 |
| 30/07/2019 | 0 |
| 30/07/2019 | 0 |
| 30/07/2019 | 0 |
| 30/07/2019 | 0 |
| 30/07/2019 | 0 |
| 31/07/2019 | 0 |
| 31/07/2019 | 0 |
| 31/07/2019 | 0 |
| 31/07/2019 | 0 |
| 31/07/2019 | 0 |
| 31/07/2019 | 0 |
| 31/07/2019 | 0 |
| 31/07/2019 | 0 |
| 31/07/2019 | 0 |
| 31/07/2019 | 0 |
| 31/07/2019 | 0 |
| 31/07/2019 | 0 |
| 31/07/2019 | 0 |
| 31/07/2019 | 0 |
| 31/07/2019 | 0 |
| 31/07/2019 | 0 |
| 31/07/2019 | 0 |
| 31/07/2019 | 0 |
| 31/07/2019 | 0 |
| 31/07/2019 | 0 |
| 31/07/2019 | 0 |
| 31/07/2019 | 0 |
| 31/07/2019 | 0 |
| 31/07/2019 | 0 |
| 01/08/2019 | 0 |
| 01/08/2019 | 0 |
| 01/08/2019 | 0 |
| 01/08/2019 | 0 |
| 01/08/2019 | 0 |
| 01/08/2019 | 0 |
| 01/08/2019 | 0 |
| 01/08/2019 | 0 |
| 01/08/2019 | 0 |
| 01/08/2019 | 0 |
| 01/08/2019 | 0 |
| 01/08/2019 | 0 |
| 01/08/2019 | 0 |
| 01/08/2019 | 0 |
| 01/08/2019 | 10.6 |
| 01/08/2019 | 0 |
| 01/08/2019 | 0 |
| 01/08/2019 | 0 |
| 01/08/2019 | 0 |
| 01/08/2019 | 0 |
| 01/08/2019 | 0 |
| 01/08/2019 | 0 |
| 01/08/2019 | 0 |
| 01/08/2019 | 0 |
| 02/08/2019 | 0 |
| 02/08/2019 | 0 |
| 02/08/2019 | 0 |
| 02/08/2019 | 0 |
| 02/08/2019 | 0 |
| 02/08/2019 | 0 |
| 02/08/2019 | 0 |
| 02/08/2019 | 0 |
| 02/08/2019 | 0 |
| 02/08/2019 | 0 |
| 02/08/2019 | 0 |
| 02/08/2019 | 0 |
| 02/08/2019 | 0 |
| 02/08/2019 | 0 |
| 02/08/2019 | 0 |
| 02/08/2019 | 0 |
| 02/08/2019 | 0 |
| 02/08/2019 | 0 |
| 02/08/2019 | 0 |
| 02/08/2019 | 0 |
| 02/08/2019 | 0 |
| 02/08/2019 | 0 |
| 02/08/2019 | 0 |
| 02/08/2019 | 0 |
| 03/08/2019 | 0 |
| 03/08/2019 | 0 |
| 03/08/2019 | 0 |
| 03/08/2019 | 0 |
| 03/08/2019 | 0 |
| 03/08/2019 | 0 |
| 03/08/2019 | 0 |
| 03/08/2019 | 0 |
| 03/08/2019 | 0 |
| 03/08/2019 | 0 |
| 03/08/2019 | 0 |
| 03/08/2019 | 0 |
| 03/08/2019 | 0 |
| 03/08/2019 | 0.1 |
| 03/08/2019 | 0 |
| 03/08/2019 | 0 |
| 03/08/2019 | 0 |
| 03/08/2019 | 0 |
| 03/08/2019 | 0 |
| 03/08/2019 | 0 |
| 03/08/2019 | 0 |
| 03/08/2019 | 0 |
| 03/08/2019 | 0 |
| 03/08/2019 | 0 |
| 04/08/2019 | 0 |
| 04/08/2019 | 0 |
| 04/08/2019 | 0 |
| 04/08/2019 | 0 |
| 04/08/2019 | 0 |
| 04/08/2019 | 0 |
| 04/08/2019 | 0 |
| 04/08/2019 | 0 |
| 04/08/2019 | 0 |
| 04/08/2019 | 0 |
| 04/08/2019 | 0 |
| 04/08/2019 | 0 |
| 04/08/2019 | 0 |
| 04/08/2019 | 0 |
| 04/08/2019 | 0 |
| 04/08/2019 | 0 |
| 04/08/2019 | 0 |
| 04/08/2019 | 0 |
| 04/08/2019 | 0 |
| 04/08/2019 | 0 |
| 04/08/2019 | 0 |
| 04/08/2019 | 0 |
| 04/08/2019 | 0 |
| 04/08/2019 | 0.2 |
| 05/08/2019 | 0 |
| 05/08/2019 | 0 |
| 05/08/2019 | 0 |
| 05/08/2019 | 0 |
| 05/08/2019 | 0 |
| 05/08/2019 | 0 |
| 05/08/2019 | 0 |
| 05/08/2019 | 0 |
| 05/08/2019 | 0 |
| 05/08/2019 | 0 |
| 05/08/2019 | 0 |
| 05/08/2019 | 0 |
| 05/08/2019 | 0 |
| 05/08/2019 | 0 |
| 05/08/2019 | 0 |
| 05/08/2019 | 0 |
| 05/08/2019 | 0 |
| 05/08/2019 | 0 |
| 05/08/2019 | 0 |
| 05/08/2019 | 0 |
| 05/08/2019 | 0 |
| 05/08/2019 | 0 |
| 05/08/2019 | 0 |
| 05/08/2019 | 0 |
| 06/08/2019 | 0 |
| 06/08/2019 | 0 |
| 06/08/2019 | 0 |
| 06/08/2019 | 0 |
| 06/08/2019 | 0 |
| 06/08/2019 | 0 |
| 06/08/2019 | 0 |
| 06/08/2019 | 0 |
| 06/08/2019 | 0 |
| 06/08/2019 | 0 |
| 06/08/2019 | 0 |
| 06/08/2019 | 0 |
| 06/08/2019 | 0 |
| 06/08/2019 | 0 |
| 06/08/2019 | 0 |
| 06/08/2019 | 0 |
| 06/08/2019 | 0 |
| 06/08/2019 | 0 |
| 06/08/2019 | 0 |
| 06/08/2019 | 0 |
| 06/08/2019 | 0 |
| 06/08/2019 | 0 |
| 06/08/2019 | 0 |
| 06/08/2019 | 0 |
| 07/08/2019 | 0 |
| 07/08/2019 | 0 |
| 07/08/2019 | 0 |
| 07/08/2019 | 0 |
| 07/08/2019 | 0 |
| 07/08/2019 | 0 |
| 07/08/2019 | 0 |
| 07/08/2019 | 0 |
| 07/08/2019 | 0 |
| 07/08/2019 | 0 |
| 07/08/2019 | 0 |
| 07/08/2019 | 0 |
| 07/08/2019 | 0 |
| 07/08/2019 | 0 |
| 07/08/2019 | 0 |
| 07/08/2019 | 0 |
| 07/08/2019 | 0 |
| 07/08/2019 | 0 |
| 07/08/2019 | 0 |
| 07/08/2019 | 0 |
| 07/08/2019 | 0 |
| 07/08/2019 | 0 |
| 07/08/2019 | 0 |
| 07/08/2019 | 0 |
| 08/08/2019 | 0 |
| 08/08/2019 | 0 |
| 08/08/2019 | 0 |
| 08/08/2019 | 0 |
| 08/08/2019 | 0 |
| 08/08/2019 | 0 |
| 08/08/2019 | 0 |
| 08/08/2019 | 0 |
| 08/08/2019 | 0 |
| 08/08/2019 | 0 |
| 08/08/2019 | 0 |
| 08/08/2019 | 0 |
| 08/08/2019 | 0 |
| 08/08/2019 | 0 |
| 08/08/2019 | 0 |
| 08/08/2019 | 0 |
| 08/08/2019 | 0 |
| 08/08/2019 | 0 |
| 08/08/2019 | 0 |
| 08/08/2019 | 0 |
| 08/08/2019 | 0 |
| 08/08/2019 | 0 |
| 08/08/2019 | 0 |
| 08/08/2019 | 0 |
| 09/08/2019 | 0 |
| 09/08/2019 | 0 |
| 09/08/2019 | 0 |
| 09/08/2019 | 0 |
| 09/08/2019 | 0 |
| 09/08/2019 | 0 |
| 09/08/2019 | 0 |
| 09/08/2019 | 0 |
| 09/08/2019 | 0 |
| 09/08/2019 | 0 |
| 09/08/2019 | 0 |
| 09/08/2019 | 0 |
| 09/08/2019 | 0 |
| 09/08/2019 | 0 |
| 09/08/2019 | 0 |
| 09/08/2019 | 0 |
| 09/08/2019 | 0 |
| 09/08/2019 | 0 |
| 09/08/2019 | 0 |
| 09/08/2019 | 0 |
| 09/08/2019 | 0 |
| 09/08/2019 | 0 |
| 09/08/2019 | 0 |
| 09/08/2019 | 0 |
| 10/08/2019 | 0 |
| 10/08/2019 | 0 |
| 10/08/2019 | 0 |
| 10/08/2019 | 0 |
| 10/08/2019 | 8.7 |
| 10/08/2019 | 0.8 |
| 10/08/2019 | 15.7 |
| 10/08/2019 | 2.1 |
| 10/08/2019 | 0 |
| 10/08/2019 | 0.2 |
| 10/08/2019 | 0 |
| 10/08/2019 | 0 |
| 10/08/2019 | 0 |
| 10/08/2019 | 0.1 |
| 10/08/2019 | 0 |
| 10/08/2019 | 0 |
| 10/08/2019 | 0 |
| 10/08/2019 | 0 |
| 10/08/2019 | 0 |
| 10/08/2019 | 0 |
| 10/08/2019 | 0 |
| 10/08/2019 | 0 |
| 10/08/2019 | 0 |
| 10/08/2019 | 0 |
| 11/08/2019 | 0 |
| 11/08/2019 | 0 |
| 11/08/2019 | 0 |
| 11/08/2019 | 0 |
| 11/08/2019 | 0 |
| 11/08/2019 | 0 |
| 11/08/2019 | 0 |
| 11/08/2019 | 0 |
| 11/08/2019 | 0 |
| 11/08/2019 | 0 |
| 11/08/2019 | 0 |
| 11/08/2019 | 0 |
| 11/08/2019 | 0 |
| 11/08/2019 | 0 |
| 11/08/2019 | 0 |
| 11/08/2019 | 0 |
| 11/08/2019 | 0 |
| 11/08/2019 | 0 |
| 11/08/2019 | 0 |
| 11/08/2019 | 0 |
| 11/08/2019 | 0 |
| 11/08/2019 | 0 |
| 11/08/2019 | 0 |
| 11/08/2019 | 0 |
| 12/08/2019 | 0 |
| 12/08/2019 | 0 |
| 12/08/2019 | 0 |
| 12/08/2019 | 0 |
| 12/08/2019 | 0 |
| 12/08/2019 | 0 |
| 12/08/2019 | 0 |
| 12/08/2019 | 0.1 |
| 12/08/2019 | 0 |
| 12/08/2019 | 0 |
| 12/08/2019 | 0 |
| 12/08/2019 | 0 |
| 12/08/2019 | 0 |
| 12/08/2019 | 0.3 |
| 12/08/2019 | 0 |
| 12/08/2019 | 0.4 |
| 12/08/2019 | 1.2 |
| 12/08/2019 | 4.8 |
| 12/08/2019 | 0.8 |
| 12/08/2019 | 0 |
| 12/08/2019 | 0 |
| 12/08/2019 | 0.3 |
| 12/08/2019 | 0.1 |
| 12/08/2019 | 0 |
| 13/08/2019 | 0 |
| 13/08/2019 | 0 |
| 13/08/2019 | 0 |
| 13/08/2019 | 0 |
| 13/08/2019 | 0 |
| 13/08/2019 | 0 |
| 13/08/2019 | 0 |
| 13/08/2019 | 0 |
| 13/08/2019 | 0 |
| 13/08/2019 | 0 |
| 13/08/2019 | 0 |
| 13/08/2019 | 0 |
| 13/08/2019 | 0 |
| 13/08/2019 | 0 |
| 13/08/2019 | 0 |
| 13/08/2019 | 0 |
| 13/08/2019 | 0 |
| 13/08/2019 | 0 |
| 13/08/2019 | 0 |
| 13/08/2019 | 0 |
| 13/08/2019 | 0 |
| 13/08/2019 | 0 |
| 13/08/2019 | 0 |
| 13/08/2019 | 0 |
| 14/08/2019 | 0 |
| 14/08/2019 | 0 |
| 14/08/2019 | 0 |
| 14/08/2019 | 0 |
| 14/08/2019 | 0 |
| 14/08/2019 | 0 |
| 14/08/2019 | 0 |
| 14/08/2019 | 0 |
| 14/08/2019 | 0 |
| 14/08/2019 | 0 |
| 14/08/2019 | 0 |
| 14/08/2019 | 0 |
| 14/08/2019 | 0 |
| 14/08/2019 | 0 |
| 14/08/2019 | 0 |
| 14/08/2019 | 0 |
| 14/08/2019 | 5.6 |
| 14/08/2019 | 0 |
| 14/08/2019 | 0 |
| 14/08/2019 | 0 |
| 14/08/2019 | 0 |
| 14/08/2019 | 0 |
| 14/08/2019 | 0 |
| 14/08/2019 | 0 |
| 15/08/2019 | 0 |
| 15/08/2019 | 0 |
| 15/08/2019 | 0 |
| 15/08/2019 | 0 |
| 15/08/2019 | 0 |
| 15/08/2019 | 0 |
| 15/08/2019 | 0 |
| 15/08/2019 | 0 |
| 15/08/2019 | 0 |
| 15/08/2019 | 0 |
| 15/08/2019 | 0 |
| 15/08/2019 | 0 |
| 15/08/2019 | 0 |
| 15/08/2019 | 0 |
| 15/08/2019 | 0 |
| 15/08/2019 | 0 |
| 15/08/2019 | 0 |
| 15/08/2019 | 0 |
| 15/08/2019 | 0 |
| 15/08/2019 | 0 |
| 15/08/2019 | 0 |
| 15/08/2019 | 0 |
| 15/08/2019 | 0 |
| 15/08/2019 | 0 |
| 16/08/2019 | 0 |
| 16/08/2019 | 0 |
| 16/08/2019 | 0 |
| 16/08/2019 | 0 |
| 16/08/2019 | 0 |
| 16/08/2019 | 0 |
| 16/08/2019 | 0 |
| 16/08/2019 | 0 |
| 16/08/2019 | 0 |
| 16/08/2019 | 0 |
| 16/08/2019 | 0 |
| 16/08/2019 | 0 |
| 16/08/2019 | 0 |
| 16/08/2019 | 0 |
| 16/08/2019 | 0 |
| 16/08/2019 | 0 |
| 16/08/2019 | 0 |
| 16/08/2019 | 0 |
| 16/08/2019 | 0 |
| 16/08/2019 | 0 |
| 16/08/2019 | 0 |
| 16/08/2019 | 0 |
| 16/08/2019 | 0 |
| 16/08/2019 | 0 |
| 17/08/2019 | 0 |
| 17/08/2019 | 0 |
| 17/08/2019 | 0 |
| 17/08/2019 | 0 |
| 17/08/2019 | 0 |
| 17/08/2019 | 0 |
| 17/08/2019 | 0 |
| 17/08/2019 | 0 |
| 17/08/2019 | 0 |
| 17/08/2019 | 0 |
| 17/08/2019 | 0 |
| 17/08/2019 | 0 |
| 17/08/2019 | 0 |
| 17/08/2019 | 0 |
| 17/08/2019 | 0 |
| 17/08/2019 | 0 |
| 17/08/2019 | 0 |
| 17/08/2019 | 0 |
| 17/08/2019 | 0 |
| 17/08/2019 | 0 |
| 17/08/2019 | 0 |
| 17/08/2019 | 0 |
| 17/08/2019 | 0 |
| 17/08/2019 | 0 |
| 18/08/2019 | 0 |
| 18/08/2019 | 0 |
| 18/08/2019 | 0 |
| 18/08/2019 | 0 |
| 18/08/2019 | 0 |
| 18/08/2019 | 0 |
| 18/08/2019 | 0 |
| 18/08/2019 | 0 |
| 18/08/2019 | 0 |
| 18/08/2019 | 0 |
| 18/08/2019 | 0 |
| 18/08/2019 | 0 |
| 18/08/2019 | 0 |
| 18/08/2019 | 0 |
| 18/08/2019 | 0 |
| 18/08/2019 | 0 |
| 18/08/2019 | 0 |
| 18/08/2019 | 0 |
| 18/08/2019 | 0 |
| 18/08/2019 | 0 |
| 18/08/2019 | 0 |
| 18/08/2019 | 0 |
| 18/08/2019 | 0 |
| 18/08/2019 | 0 |
| 19/08/2019 | 0 |
| 19/08/2019 | 0 |
| 19/08/2019 | 0 |
| 19/08/2019 | 0 |
| 19/08/2019 | 0 |
| 19/08/2019 | 0 |
| 19/08/2019 | 0 |
| 19/08/2019 | 0 |
| 19/08/2019 | 0 |
| 19/08/2019 | 0 |
| 19/08/2019 | 0 |
| 19/08/2019 | 0 |
| 19/08/2019 | 0 |
| 19/08/2019 | 0 |
| 19/08/2019 | 0 |
| 19/08/2019 | 0 |
| 19/08/2019 | 0 |
| 19/08/2019 | 0 |
| 19/08/2019 | 0 |
| 19/08/2019 | 0 |
| 19/08/2019 | 0 |
| 19/08/2019 | 0 |
| 19/08/2019 | 0 |
| 19/08/2019 | 0 |
| 20/08/2019 | 0 |
| 20/08/2019 | 0 |
| 20/08/2019 | 0 |
| 20/08/2019 | 0 |
| 20/08/2019 | 0 |
| 20/08/2019 | 0 |
| 20/08/2019 | 0 |
| 20/08/2019 | 0 |
| 20/08/2019 | 0 |
| 20/08/2019 | 0 |
| 20/08/2019 | 0 |
| 20/08/2019 | 0 |
| 20/08/2019 | 0 |
| 20/08/2019 | 0 |
| 20/08/2019 | 0 |
| 20/08/2019 | 0 |
| 20/08/2019 | 0 |
| 20/08/2019 | 0 |
| 20/08/2019 | 0 |
| 20/08/2019 | 0 |
| 20/08/2019 | 0 |
| 20/08/2019 | 0 |
| 20/08/2019 | 0 |
| 20/08/2019 | 0 |
| 21/08/2019 | 0 |
| 21/08/2019 | 0 |
| 21/08/2019 | 0 |
| 21/08/2019 | 0 |
| 21/08/2019 | 0 |
| 21/08/2019 | 0 |
| 21/08/2019 | 0 |
| 21/08/2019 | 0 |
| 21/08/2019 | 0 |
| 21/08/2019 | 0 |
| 21/08/2019 | 0 |
| 21/08/2019 | 0 |
| 21/08/2019 | 0 |
| 21/08/2019 | 0 |
| 21/08/2019 | 0 |
| 21/08/2019 | 0 |
| 21/08/2019 | 0 |
| 21/08/2019 | 0 |
| 21/08/2019 | 0 |
| 21/08/2019 | 0 |
| 21/08/2019 | 0 |
| 21/08/2019 | 0 |
| 21/08/2019 | 0 |
| 21/08/2019 | 0 |
| 22/08/2019 | 0 |
| 22/08/2019 | 0 |
| 22/08/2019 | 0 |
| 22/08/2019 | 0 |
| 22/08/2019 | 0 |
| 22/08/2019 | 0 |
| 22/08/2019 | 0 |
| 22/08/2019 | 0 |
| 22/08/2019 | 0 |
| 22/08/2019 | 0 |
| 22/08/2019 | 0 |
| 22/08/2019 | 0 |
| 22/08/2019 | 0 |
| 22/08/2019 | 0 |
| 22/08/2019 | 0 |
| 22/08/2019 | 0 |
| 22/08/2019 | 0 |
| 22/08/2019 | 0 |
| 22/08/2019 | 0 |
| 22/08/2019 | 0 |
| 22/08/2019 | 0 |
| 22/08/2019 | 0 |
| 22/08/2019 | 0 |
| 22/08/2019 | 0 |
| 23/08/2019 | 0 |
| 23/08/2019 | 0 |
| 23/08/2019 | 0 |
| 23/08/2019 | 0 |
| 23/08/2019 | 0 |
| 23/08/2019 | 0 |
| 23/08/2019 | 0 |
| 23/08/2019 | 0 |
| 23/08/2019 | 0 |
| 23/08/2019 | 0 |
| 23/08/2019 | 0 |
| 23/08/2019 | 0 |
| 23/08/2019 | 0 |
| 23/08/2019 | 0 |
| 23/08/2019 | 0 |
| 23/08/2019 | 0 |
| 23/08/2019 | 0 |
| 23/08/2019 | 0 |
| 23/08/2019 | 0 |
| 23/08/2019 | 0 |
| 23/08/2019 | 0 |
| 23/08/2019 | 0 |
| 23/08/2019 | 0 |
| 23/08/2019 | 0 |
| 24/08/2019 | 0 |
| 24/08/2019 | 0 |
| 24/08/2019 | 0 |
| 24/08/2019 | 0 |
| 24/08/2019 | 0 |
| 24/08/2019 | 0 |
| 24/08/2019 | 3.4 |
| 24/08/2019 | 0 |
| 24/08/2019 | 0 |
| 24/08/2019 | 1.2 |
| 24/08/2019 | 17 |
| 24/08/2019 | 0 |
| 24/08/2019 | 0 |
| 24/08/2019 | 0 |
| 24/08/2019 | 0 |
| 24/08/2019 | 0 |
| 24/08/2019 | 0 |
| 24/08/2019 | 0 |
| 24/08/2019 | 0 |
| 24/08/2019 | 0 |
| 24/08/2019 | 0 |
| 24/08/2019 | 0.1 |
| 24/08/2019 | 0 |
| 24/08/2019 | 0 |
| 25/08/2019 | 0 |
| 25/08/2019 | 0 |
| 25/08/2019 | 0 |
| 25/08/2019 | 0 |
| 25/08/2019 | 0 |
| 25/08/2019 | 0.3 |
| 25/08/2019 | 0 |
| 25/08/2019 | 1.4 |
| 25/08/2019 | 0.6 |
| 25/08/2019 | 0 |
| 25/08/2019 | 0 |
| 25/08/2019 | 0 |
| 25/08/2019 | 0 |
| 25/08/2019 | 0 |
| 25/08/2019 | 0 |
| 25/08/2019 | 0 |
| 25/08/2019 | 0 |
| 25/08/2019 | 0 |
| 25/08/2019 | 0 |
| 25/08/2019 | 0 |
| 25/08/2019 | 0 |
| 25/08/2019 | 0 |
| 25/08/2019 | 0 |
| 25/08/2019 | 0 |
| 26/08/2019 | 0 |
| 26/08/2019 | 0 |
| 26/08/2019 | 0 |
| 26/08/2019 | 0 |
| 26/08/2019 | 0 |
| 26/08/2019 | 0 |
| 26/08/2019 | 0 |
| 26/08/2019 | 0 |
| 26/08/2019 | 0 |
| 26/08/2019 | 0 |
| 26/08/2019 | 0 |
| 26/08/2019 | 0 |
| 26/08/2019 | 0 |
| 26/08/2019 | 0 |
| 26/08/2019 | 0 |
| 26/08/2019 | 0 |
| 26/08/2019 | 0 |
| 26/08/2019 | 0 |
| 26/08/2019 | 0 |
| 26/08/2019 | 0 |
| 26/08/2019 | 0 |
| 26/08/2019 | 0 |
| 26/08/2019 | 0 |
| 26/08/2019 | 0 |
| 27/08/2019 | 0 |
| 27/08/2019 | 0 |
| 27/08/2019 | 0 |
| 27/08/2019 | 0 |
| 27/08/2019 | 0 |
| 27/08/2019 | 0 |
| 27/08/2019 | 0 |
| 27/08/2019 | 0 |
| 27/08/2019 | 0 |
| 27/08/2019 | 0 |
| 27/08/2019 | 0 |
| 27/08/2019 | 0.1 |
| 27/08/2019 | 0 |
| 27/08/2019 | 0 |
| 27/08/2019 | 0.1 |
| 27/08/2019 | 0 |
| 27/08/2019 | 0 |
| 27/08/2019 | 0 |
| 27/08/2019 | 0 |
| 27/08/2019 | 0 |
| 27/08/2019 | 0 |
| 27/08/2019 | 0 |
| 27/08/2019 | 0 |
| 27/08/2019 | 0 |
| 28/08/2019 | 0 |
| 28/08/2019 | 0 |
| 28/08/2019 | 0 |
| 28/08/2019 | 0 |
| 28/08/2019 | 0 |
| 28/08/2019 | 0 |
| 28/08/2019 | 0 |
| 28/08/2019 | 0 |
| 28/08/2019 | 0 |
| 28/08/2019 | 0 |
| 28/08/2019 | 0 |
| 28/08/2019 | 0 |
| 28/08/2019 | 0 |
| 28/08/2019 | 0 |
| 28/08/2019 | 0 |
| 28/08/2019 | 0 |
| 28/08/2019 | 0 |
| 28/08/2019 | 0 |
| 28/08/2019 | 0 |
| 28/08/2019 | 0 |
| 28/08/2019 | 0 |
| 28/08/2019 | 0 |
| 28/08/2019 | 0 |
| 28/08/2019 | 0 |
| 29/08/2019 | 0 |
| 29/08/2019 | 0 |
| 29/08/2019 | 0 |
| 29/08/2019 | 0 |
| 29/08/2019 | 0 |
| 29/08/2019 | 0 |
| 29/08/2019 | 0 |
| 29/08/2019 | 0 |
| 29/08/2019 | 0 |
| 29/08/2019 | 0 |
| 29/08/2019 | 0 |
| 29/08/2019 | 0 |
| 29/08/2019 | 0 |
| 29/08/2019 | 0 |
| 29/08/2019 | 0 |
| 29/08/2019 | 0 |
| 29/08/2019 | 0 |
| 29/08/2019 | 0 |
| 29/08/2019 | 0 |
| 29/08/2019 | 0 |
| 29/08/2019 | 0 |
| 29/08/2019 | 0 |
| 29/08/2019 | 0 |
| 29/08/2019 | 0 |
| 30/08/2019 | 0 |
| 30/08/2019 | 0 |
| 30/08/2019 | 0 |
| 30/08/2019 | 0 |
| 30/08/2019 | 0 |
| 30/08/2019 | 0 |
| 30/08/2019 | 0 |
| 30/08/2019 | 0 |
| 30/08/2019 | 0 |
| 30/08/2019 | 0 |
| 30/08/2019 | 0 |
| 30/08/2019 | 0 |
| 30/08/2019 | 0 |
| 30/08/2019 | 0 |
| 30/08/2019 | 0 |
| 30/08/2019 | 0 |
| 30/08/2019 | 0 |
| 30/08/2019 | 0 |
| 30/08/2019 | 0 |
| 30/08/2019 | 0 |
| 30/08/2019 | 0 |
| 30/08/2019 | 0 |
| 30/08/2019 | 0 |
| 30/08/2019 | 0 |
| 31/08/2019 | 0 |
| 31/08/2019 | 0 |
| 31/08/2019 | 0 |
| 31/08/2019 | 0 |
| 31/08/2019 | 0 |
| 31/08/2019 | 0 |
| 31/08/2019 | 0 |
| 31/08/2019 | 0 |
| 31/08/2019 | 0 |
| 31/08/2019 | 0 |
| 31/08/2019 | 0 |
| 31/08/2019 | 0 |
| 31/08/2019 | 0 |
| 31/08/2019 | 0 |
| 31/08/2019 | 0 |
| 31/08/2019 | 0 |
| 31/08/2019 | 0 |
| 31/08/2019 | 0 |
| 31/08/2019 | 0 |
| 31/08/2019 | 0 |
| 31/08/2019 | 0 |
| 31/08/2019 | 0 |
| 31/08/2019 | 0 |
| 31/08/2019 | 0 |